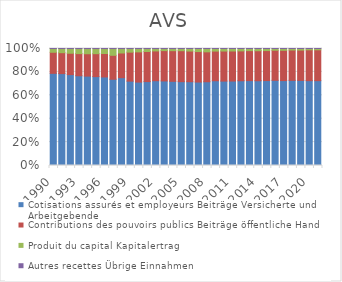
| Category | Cotisations assurés et employeurs | Contributions des pouvoirs publics | Produit du capital | Autres recettes |
|---|---|---|---|---|
| 1990.0 | 0.788 | 0.18 | 0.032 | 0 |
| 1991.0 | 0.785 | 0.179 | 0.035 | 0 |
| 1992.0 | 0.777 | 0.183 | 0.04 | 0 |
| 1993.0 | 0.767 | 0.189 | 0.043 | 0.001 |
| 1994.0 | 0.764 | 0.191 | 0.044 | 0.001 |
| 1995.0 | 0.76 | 0.196 | 0.044 | 0 |
| 1996.0 | 0.757 | 0.2 | 0.042 | 0 |
| 1997.0 | 0.737 | 0.205 | 0.058 | 0 |
| 1998.0 | 0.751 | 0.211 | 0.038 | 0 |
| 1999.0 | 0.721 | 0.248 | 0.031 | 0 |
| 2000.0 | 0.713 | 0.258 | 0.028 | 0 |
| 2001.0 | 0.717 | 0.257 | 0.025 | 0 |
| 2002.0 | 0.725 | 0.255 | 0.02 | 0 |
| 2003.0 | 0.723 | 0.259 | 0.018 | 0 |
| 2004.0 | 0.72 | 0.262 | 0.018 | 0 |
| 2005.0 | 0.716 | 0.265 | 0.019 | 0 |
| 2006.0 | 0.716 | 0.262 | 0.022 | 0 |
| 2007.0 | 0.713 | 0.261 | 0.026 | 0 |
| 2008.0 | 0.716 | 0.256 | 0.028 | 0 |
| 2009.0 | 0.724 | 0.254 | 0.022 | 0 |
| 2010.0 | 0.721 | 0.257 | 0.021 | 0 |
| 2011.0 | 0.722 | 0.257 | 0.021 | 0 |
| 2012.0 | 0.724 | 0.255 | 0.02 | 0 |
| 2013.0 | 0.725 | 0.256 | 0.018 | 0 |
| 2014.0 | 0.724 | 0.256 | 0.019 | 0 |
| 2015.0 | 0.726 | 0.256 | 0.018 | 0 |
| 2016.0 | 0.728 | 0.257 | 0.015 | 0 |
| 2017.0 | 0.726 | 0.259 | 0.015 | 0 |
| 2018.0 | 0.728 | 0.259 | 0.013 | 0 |
| 2019.0 | 0.727 | 0.259 | 0.014 | 0 |
| 2020.0 | 0.725 | 0.264 | 0.011 | 0 |
| 2021.0 | 0.725 | 0.264 | 0.011 | 0 |